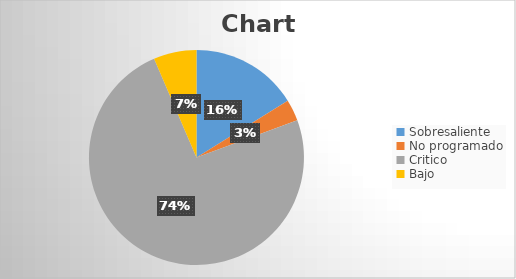
| Category | Series 0 |
|---|---|
| Sobresaliente  | 5 |
| No programado  | 1 |
| Critico  | 23 |
| Bajo  | 2 |